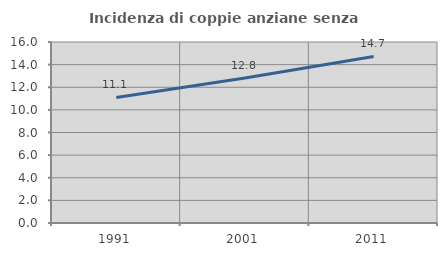
| Category | Incidenza di coppie anziane senza figli  |
|---|---|
| 1991.0 | 11.1 |
| 2001.0 | 12.813 |
| 2011.0 | 14.726 |